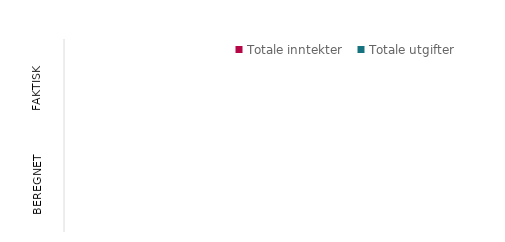
| Category | Totale inntekter | Totale utgifter |
|---|---|---|
| Beregnet | 0 | 0 |
| Faktisk | 0 | 0 |